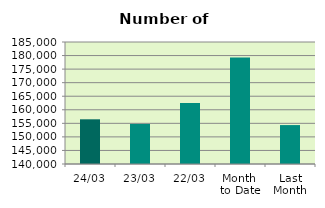
| Category | Series 0 |
|---|---|
| 24/03 | 156484 |
| 23/03 | 154794 |
| 22/03 | 162516 |
| Month 
to Date | 179305 |
| Last
Month | 154356.5 |